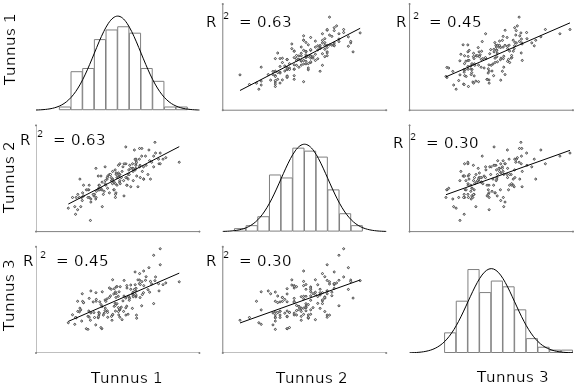
| Category | histogr_baas | histogramm |
|---|---|---|
| 1.0 | 16 | 0 |
| 2.0 | 16 | 0 |
| 3.0 | 16 | 0.212 |
| 4.0 | 16 | 2.538 |
| 5.0 | 16 | 2.75 |
| 6.0 | 16 | 4.654 |
| 7.0 | 16 | 5.288 |
| 8.0 | 16 | 5.5 |
| 9.0 | 16 | 5.077 |
| 10.0 | 16 | 2.75 |
| 11.0 | 16 | 1.904 |
| 12.0 | 16 | 0.212 |
| 13.0 | 16 | 0.212 |
| 14.0 | 16 | 0 |
| 15.0 | 16 | 0 |
| 16.0 | 16 | 0 |
| 17.0 | 8 | 0 |
| 18.0 | 8 | 0.196 |
| 19.0 | 8 | 0.393 |
| 20.0 | 8 | 0.982 |
| 21.0 | 8 | 3.732 |
| 22.0 | 8 | 3.536 |
| 23.0 | 8 | 5.5 |
| 24.0 | 8 | 5.304 |
| 25.0 | 8 | 4.911 |
| 26.0 | 8 | 2.75 |
| 27.0 | 8 | 1.179 |
| 28.0 | 8 | 0.393 |
| 29.0 | 8 | 0 |
| 30.0 | 8 | 0 |
| 31.0 | 8 | 0 |
| 32.0 | 8 | 0 |
| 33.0 | 0 | 0 |
| 34.0 | 0 | 0 |
| 35.0 | 0 | 0 |
| 36.0 | 0 | 1.328 |
| 37.0 | 0 | 3.414 |
| 38.0 | 0 | 5.5 |
| 39.0 | 0 | 3.983 |
| 40.0 | 0 | 4.741 |
| 41.0 | 0 | 4.362 |
| 42.0 | 0 | 2.845 |
| 43.0 | 0 | 0.948 |
| 44.0 | 0 | 0.379 |
| 45.0 | 0 | 0.19 |
| 46.0 | 0 | 0.19 |